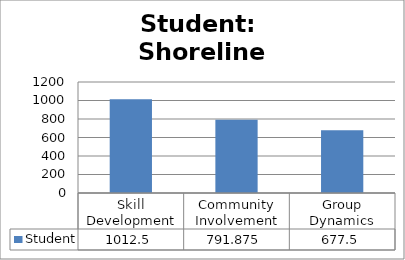
| Category | Student |
|---|---|
| Skill Development | 1012.5 |
| Community Involvement | 791.875 |
| Group Dynamics | 677.5 |